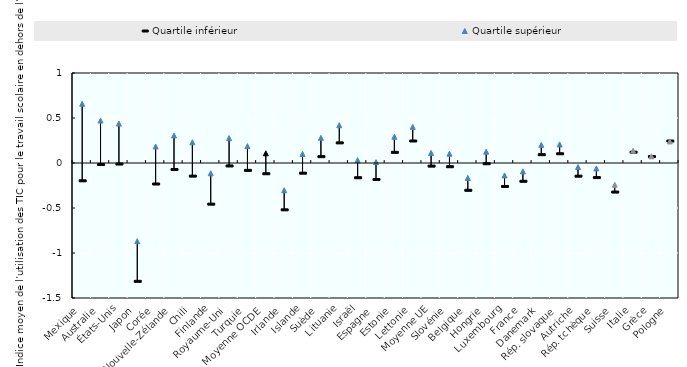
| Category | Quartile inférieur  | Quartile supérieur |
|---|---|---|
| Mexique | -0.198 | 0.658 |
| Australie | -0.017 | 0.472 |
| États-Unis | -0.012 | 0.438 |
| Japon | -1.315 | -0.869 |
| Corée | -0.233 | 0.184 |
| Nouvelle-Zélande | -0.073 | 0.306 |
| Chili | -0.146 | 0.23 |
| Finlande | -0.457 | -0.114 |
| Royaume-Uni | -0.033 | 0.276 |
| Turquie | -0.082 | 0.187 |
| Moyenne OCDE | -0.12 | 0.108 |
| Irlande | -0.52 | -0.303 |
| Islande | -0.113 | 0.101 |
| Suède | 0.07 | 0.28 |
| Lituanie | 0.223 | 0.42 |
| Israël | -0.164 | 0.031 |
| Espagne | -0.183 | 0.009 |
| Estonie | 0.118 | 0.292 |
| Lettonie | 0.244 | 0.401 |
| Moyenne UE | -0.035 | 0.111 |
| Slovénie | -0.041 | 0.103 |
| Belgique | -0.303 | -0.166 |
| Hongrie | -0.008 | 0.126 |
| Luxembourg | -0.261 | -0.138 |
| France | -0.203 | -0.093 |
| Danemark  | 0.092 | 0.201 |
| Rép. slovaque | 0.103 | 0.206 |
| Autriche | -0.146 | -0.044 |
| Rép. tchèque | -0.162 | -0.06 |
| Suisse | -0.323 | -0.241 |
| Italie | 0.12 | 0.136 |
| Grèce | 0.071 | 0.074 |
| Pologne | 0.244 | 0.24 |